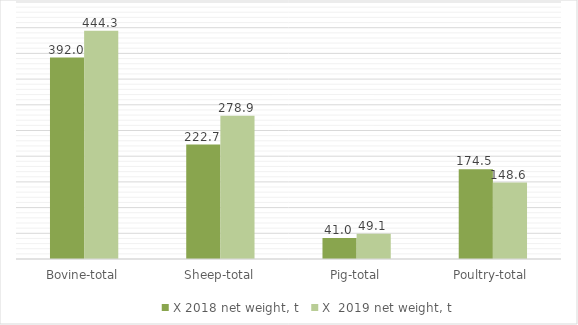
| Category | X 2018 | X  2019 |
|---|---|---|
| Bovine-total | 392 | 444.3 |
| Sheep-total | 222.7 | 278.9 |
| Pig-total | 41 | 49.1 |
| Poultry-total | 174.5 | 148.6 |